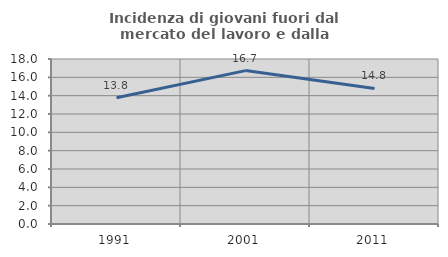
| Category | Incidenza di giovani fuori dal mercato del lavoro e dalla formazione  |
|---|---|
| 1991.0 | 13.776 |
| 2001.0 | 16.735 |
| 2011.0 | 14.793 |